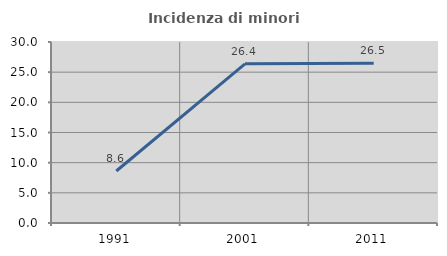
| Category | Incidenza di minori stranieri |
|---|---|
| 1991.0 | 8.621 |
| 2001.0 | 26.385 |
| 2011.0 | 26.492 |